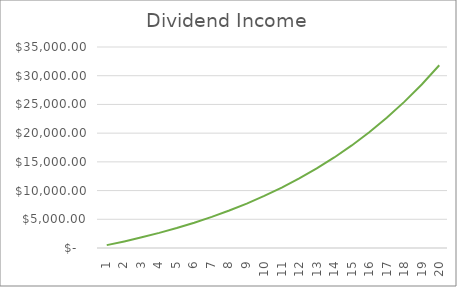
| Category | Dividend Income |
|---|---|
| 1.0 | 500 |
| 2.0 | 1147.613 |
| 3.0 | 1855.675 |
| 4.0 | 2629.895 |
| 5.0 | 3476.551 |
| 6.0 | 4402.553 |
| 7.0 | 5415.507 |
| 8.0 | 6523.795 |
| 9.0 | 7736.652 |
| 10.0 | 9064.263 |
| 11.0 | 10517.861 |
| 12.0 | 12109.845 |
| 13.0 | 13853.908 |
| 14.0 | 15765.176 |
| 15.0 | 17860.368 |
| 16.0 | 20157.974 |
| 17.0 | 22678.452 |
| 18.0 | 25444.449 |
| 19.0 | 28481.05 |
| 20.0 | 31816.05 |